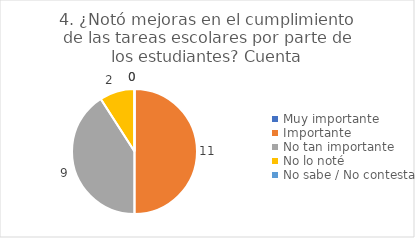
| Category | 4. ¿Notó mejoras en el cumplimiento de las tareas escolares por parte de los estudiantes? |
|---|---|
| Muy importante  | 0 |
| Importante  | 0.5 |
| No tan importante  | 0.409 |
| No lo noté  | 0.091 |
| No sabe / No contesta | 0 |